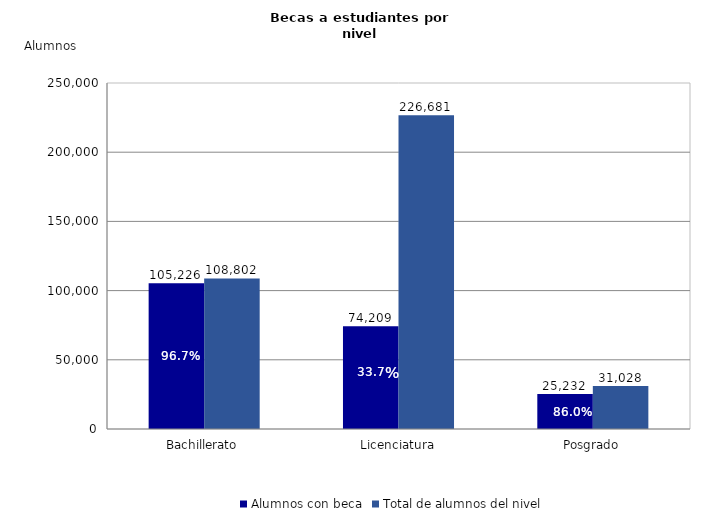
| Category | Alumnos con beca | Total de alumnos del nivel |
|---|---|---|
| Bachillerato | 105226 | 108802 |
| Licenciatura | 74209 | 226681 |
| Posgrado | 25232 | 31028 |